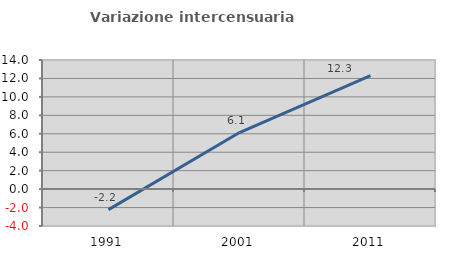
| Category | Variazione intercensuaria annua |
|---|---|
| 1991.0 | -2.225 |
| 2001.0 | 6.131 |
| 2011.0 | 12.302 |